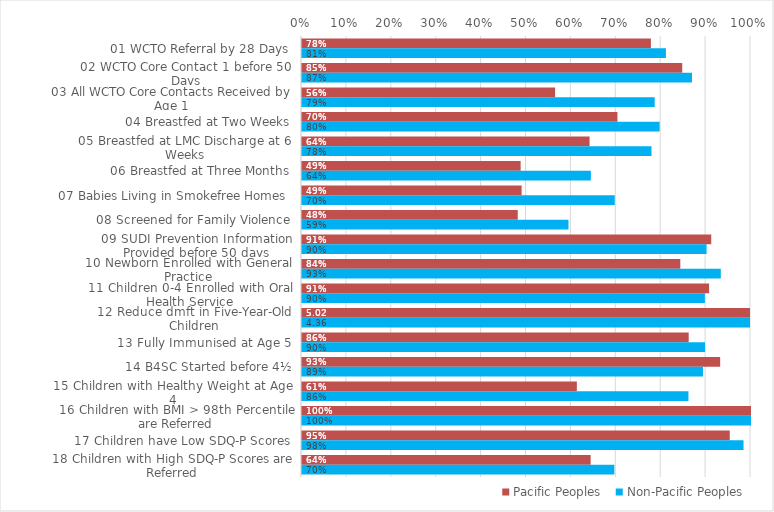
| Category | Pacific Peoples | Non-Pacific Peoples |
|---|---|---|
| 01 WCTO Referral by 28 Days | 0.777 | 0.811 |
| 02 WCTO Core Contact 1 before 50 Days | 0.847 | 0.869 |
| 03 All WCTO Core Contacts Received by Age 1 | 0.564 | 0.786 |
| 04 Breastfed at Two Weeks | 0.703 | 0.796 |
| 05 Breastfed at LMC Discharge at 6 Weeks | 0.64 | 0.778 |
| 06 Breastfed at Three Months | 0.487 | 0.643 |
| 07 Babies Living in Smokefree Homes  | 0.489 | 0.697 |
| 08 Screened for Family Violence | 0.481 | 0.594 |
| 09 SUDI Prevention Information Provided before 50 days | 0.911 | 0.901 |
| 10 Newborn Enrolled with General Practice | 0.843 | 0.933 |
| 11 Children 0-4 Enrolled with Oral Health Service | 0.907 | 0.897 |
| 12 Reduce dmft in Five-Year-Old Children | 5.024 | 4.363 |
| 13 Fully Immunised at Age 5 | 0.861 | 0.898 |
| 14 B4SC Started before 4½ | 0.931 | 0.893 |
| 15 Children with Healthy Weight at Age 4 | 0.612 | 0.861 |
| 16 Children with BMI > 98th Percentile are Referred | 1 | 1 |
| 17 Children have Low SDQ-P Scores | 0.953 | 0.983 |
| 18 Children with High SDQ-P Scores are Referred | 0.643 | 0.696 |